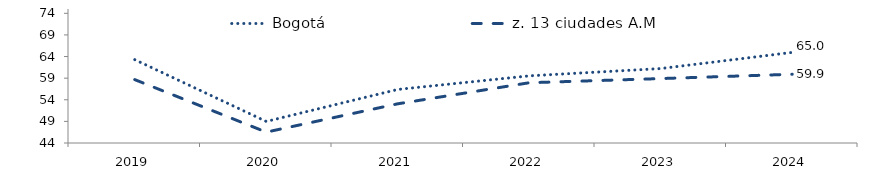
| Category | Bogotá | z. 13 ciudades A.M |
|---|---|---|
| 2019.0 | 63.278 | 58.665 |
| 2020.0 | 48.985 | 46.515 |
| 2021.0 | 56.389 | 53.067 |
| 2022.0 | 59.536 | 57.942 |
| 2023.0 | 61.223 | 58.904 |
| 2024.0 | 64.958 | 59.904 |